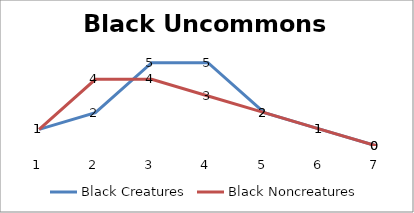
| Category | Black Creatures | Black Noncreatures |
|---|---|---|
| 0 | 1 | 1 |
| 1 | 2 | 4 |
| 2 | 5 | 4 |
| 3 | 5 | 3 |
| 4 | 2 | 2 |
| 5 | 1 | 1 |
| 6 | 0 | 0 |